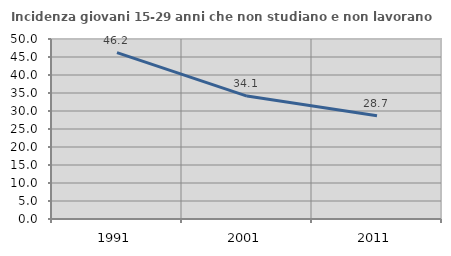
| Category | Incidenza giovani 15-29 anni che non studiano e non lavorano  |
|---|---|
| 1991.0 | 46.23 |
| 2001.0 | 34.138 |
| 2011.0 | 28.692 |